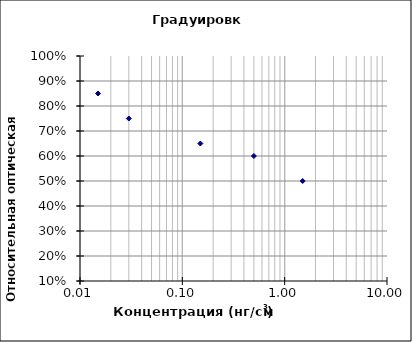
| Category | Series 0 |
|---|---|
| 0.015 | 0.85 |
| 0.03 | 0.75 |
| 0.15 | 0.65 |
| 0.5 | 0.6 |
| 1.5 | 0.5 |